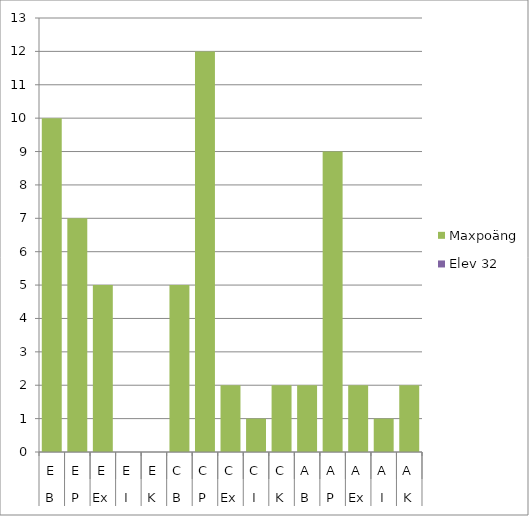
| Category | Maxpoäng | Elev 32 |
|---|---|---|
| 0 | 10 | 0 |
| 1 | 7 | 0 |
| 2 | 5 | 0 |
| 3 | 0 | 0 |
| 4 | 0 | 0 |
| 5 | 5 | 0 |
| 6 | 12 | 0 |
| 7 | 2 | 0 |
| 8 | 1 | 0 |
| 9 | 2 | 0 |
| 10 | 2 | 0 |
| 11 | 9 | 0 |
| 12 | 2 | 0 |
| 13 | 1 | 0 |
| 14 | 2 | 0 |